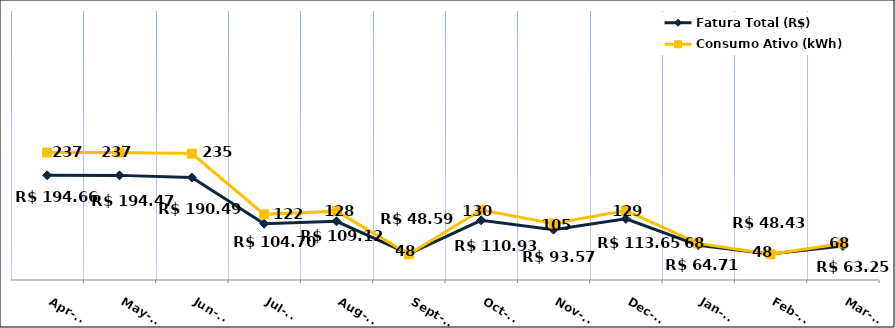
| Category | Fatura Total (R$) |
|---|---|
| 2023-04-01 | 194.66 |
| 2023-05-01 | 194.47 |
| 2023-06-01 | 190.49 |
| 2023-07-01 | 104.7 |
| 2023-08-01 | 109.12 |
| 2023-09-01 | 48.59 |
| 2023-10-01 | 110.93 |
| 2023-11-01 | 93.57 |
| 2023-12-01 | 113.65 |
| 2024-01-01 | 64.71 |
| 2024-02-01 | 48.43 |
| 2024-03-01 | 63.25 |